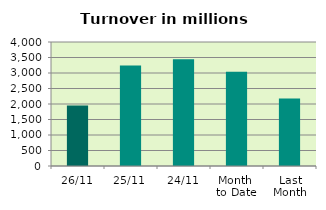
| Category | Series 0 |
|---|---|
| 26/11 | 1948.219 |
| 25/11 | 3240.548 |
| 24/11 | 3439.663 |
| Month 
to Date | 3038.254 |
| Last
Month | 2179.795 |